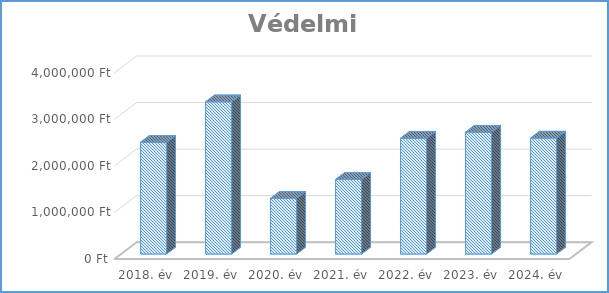
| Category | Védelmi  |
|---|---|
| 2018. év | 2400000 |
| 2019. év | 3268000 |
| 2020. év | 1195000 |
| 2021. év | 1600000 |
| 2022. év | 2486460 |
| 2023. év | 2616200 |
| 2024. év | 2489200 |